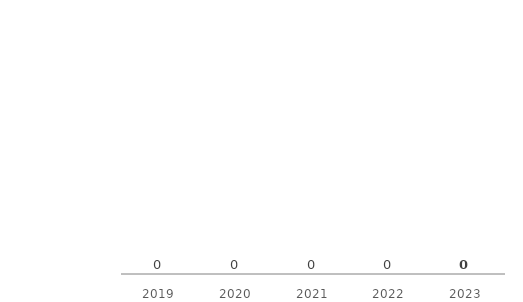
| Category | Assets in Kazakhstan |
|---|---|
| 2019.0 | 0 |
| 2020.0 | 0 |
| 2021.0 | 0 |
| 2022.0 | 0 |
| 2023.0 | 0 |